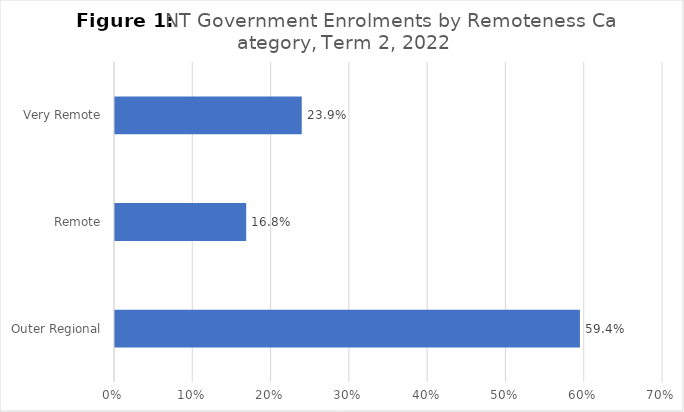
| Category | Series 0 |
|---|---|
| Outer Regional | 0.594 |
| Remote | 0.168 |
| Very Remote | 0.239 |